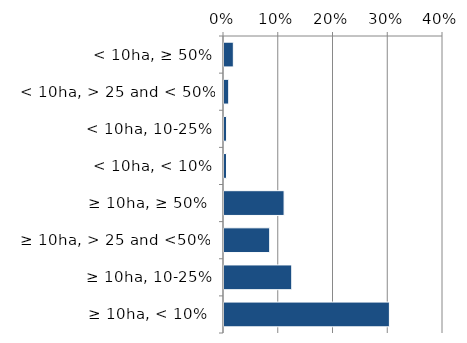
| Category | Non native |
|---|---|
|  ≥ 10ha, < 10%  | 0.302 |
|   ≥ 10ha, 10-25% | 0.124 |
|   ≥ 10ha, > 25 and <50%  | 0.083 |
|   ≥ 10ha, ≥ 50%  | 0.11 |
|  < 10ha, < 10% | 0.005 |
|  < 10ha, 10-25% | 0.005 |
|  < 10ha, > 25 and < 50% | 0.009 |
|  < 10ha, ≥ 50% | 0.017 |